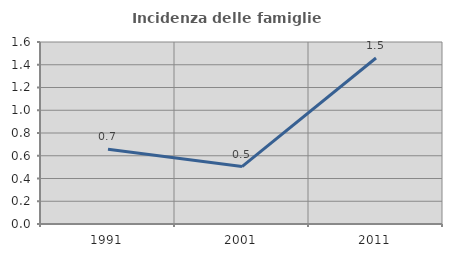
| Category | Incidenza delle famiglie numerose |
|---|---|
| 1991.0 | 0.658 |
| 2001.0 | 0.505 |
| 2011.0 | 1.459 |